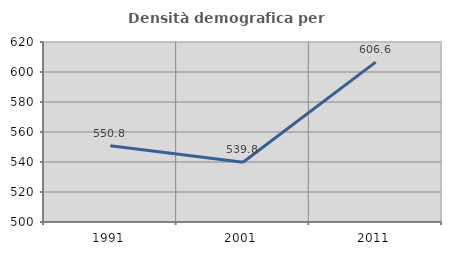
| Category | Densità demografica |
|---|---|
| 1991.0 | 550.796 |
| 2001.0 | 539.816 |
| 2011.0 | 606.591 |